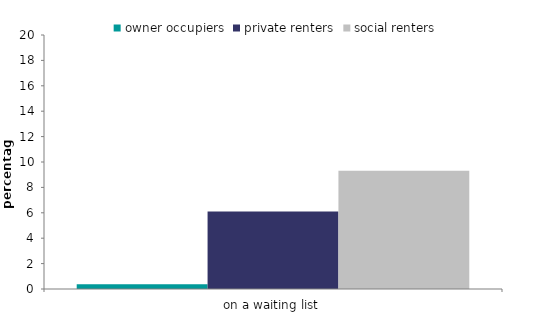
| Category | owner occupiers | private renters | social renters |
|---|---|---|---|
| on a waiting list | 0.376 | 6.098 | 9.316 |